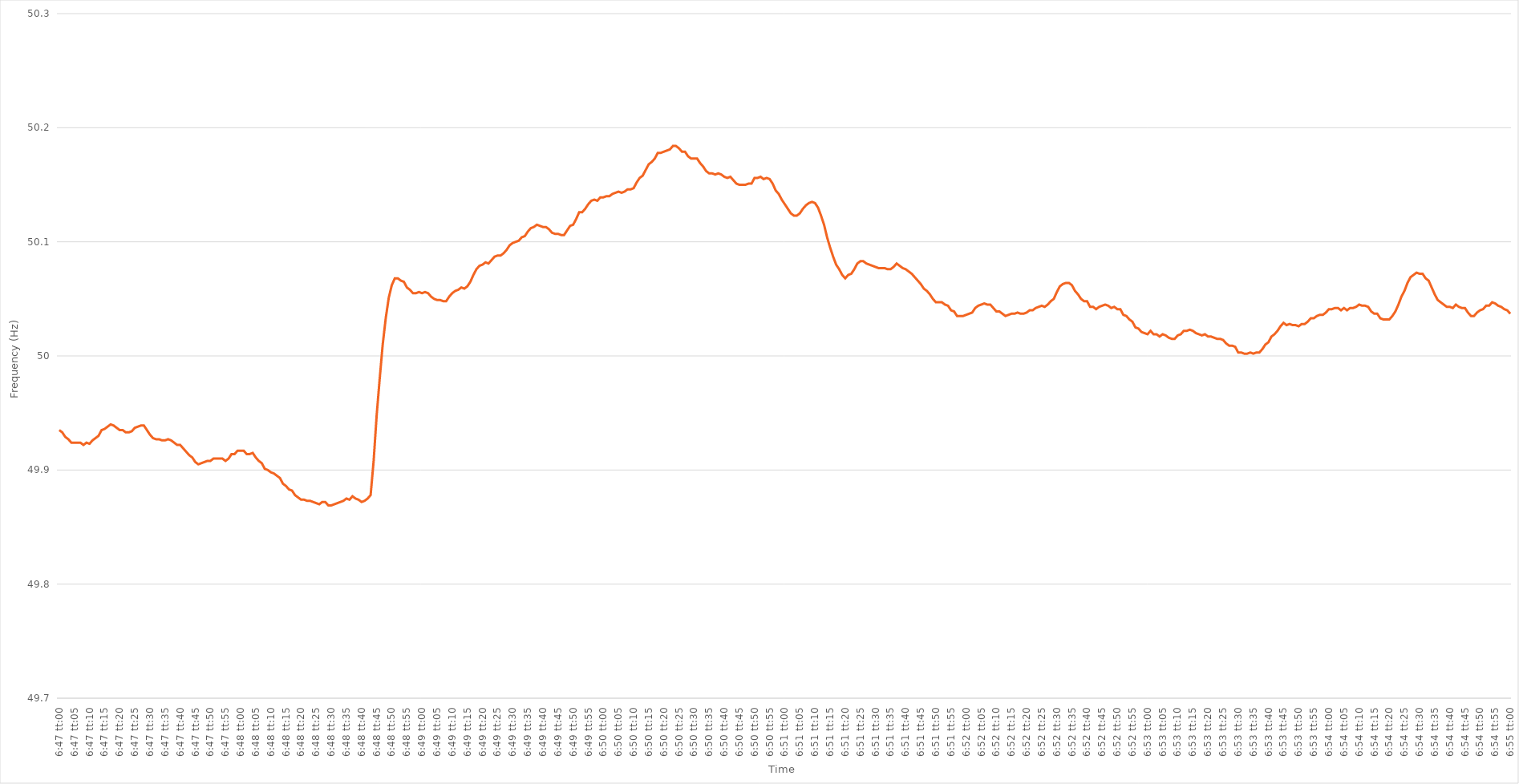
| Category | Series 0 |
|---|---|
| 0.2826388888888889 | 49.935 |
| 0.282650462962963 | 49.933 |
| 0.282662037037037 | 49.929 |
| 0.2826736111111111 | 49.927 |
| 0.2826851851851852 | 49.924 |
| 0.28269675925925924 | 49.924 |
| 0.28270833333333334 | 49.924 |
| 0.28271990740740743 | 49.924 |
| 0.2827314814814815 | 49.922 |
| 0.28274305555555557 | 49.924 |
| 0.28275462962962966 | 49.923 |
| 0.2827662037037037 | 49.926 |
| 0.2827777777777778 | 49.928 |
| 0.28278935185185183 | 49.93 |
| 0.28280092592592593 | 49.935 |
| 0.28281249999999997 | 49.936 |
| 0.28282407407407406 | 49.938 |
| 0.28283564814814816 | 49.94 |
| 0.2828472222222222 | 49.939 |
| 0.2828587962962963 | 49.937 |
| 0.2828703703703704 | 49.935 |
| 0.2828819444444444 | 49.935 |
| 0.2828935185185185 | 49.933 |
| 0.2829050925925926 | 49.933 |
| 0.28291666666666665 | 49.934 |
| 0.28292824074074074 | 49.937 |
| 0.28293981481481484 | 49.938 |
| 0.2829513888888889 | 49.939 |
| 0.28296296296296297 | 49.939 |
| 0.28297453703703707 | 49.935 |
| 0.2829861111111111 | 49.931 |
| 0.2829976851851852 | 49.928 |
| 0.28300925925925924 | 49.927 |
| 0.28302083333333333 | 49.927 |
| 0.28303240740740737 | 49.926 |
| 0.2830439814814815 | 49.926 |
| 0.28305555555555556 | 49.927 |
| 0.2830671296296296 | 49.926 |
| 0.2830787037037037 | 49.924 |
| 0.2830902777777778 | 49.922 |
| 0.2831018518518518 | 49.922 |
| 0.2831134259259259 | 49.919 |
| 0.283125 | 49.916 |
| 0.28313657407407405 | 49.913 |
| 0.28314814814814815 | 49.911 |
| 0.28315972222222224 | 49.907 |
| 0.2831712962962963 | 49.905 |
| 0.2831828703703704 | 49.906 |
| 0.28319444444444447 | 49.907 |
| 0.2832060185185185 | 49.908 |
| 0.2832175925925926 | 49.908 |
| 0.2832291666666667 | 49.91 |
| 0.28324074074074074 | 49.91 |
| 0.2832523148148148 | 49.91 |
| 0.2832638888888889 | 49.91 |
| 0.28327546296296297 | 49.908 |
| 0.283287037037037 | 49.91 |
| 0.2832986111111111 | 49.914 |
| 0.2833101851851852 | 49.914 |
| 0.28332175925925923 | 49.917 |
| 0.2833333333333333 | 49.917 |
| 0.2833449074074074 | 49.917 |
| 0.28335648148148146 | 49.914 |
| 0.28336805555555555 | 49.914 |
| 0.28337962962962965 | 49.915 |
| 0.2833912037037037 | 49.911 |
| 0.2834027777777778 | 49.908 |
| 0.2834143518518519 | 49.906 |
| 0.2834259259259259 | 49.901 |
| 0.2834375 | 49.9 |
| 0.2834490740740741 | 49.898 |
| 0.28346064814814814 | 49.897 |
| 0.28347222222222224 | 49.895 |
| 0.28348379629629633 | 49.893 |
| 0.28349537037037037 | 49.888 |
| 0.28350694444444446 | 49.886 |
| 0.2835185185185185 | 49.883 |
| 0.2835300925925926 | 49.882 |
| 0.28354166666666664 | 49.878 |
| 0.28355324074074073 | 49.876 |
| 0.2835648148148148 | 49.874 |
| 0.28357638888888886 | 49.874 |
| 0.28358796296296296 | 49.873 |
| 0.28359953703703705 | 49.873 |
| 0.2836111111111111 | 49.872 |
| 0.2836226851851852 | 49.871 |
| 0.2836342592592593 | 49.87 |
| 0.2836458333333333 | 49.872 |
| 0.2836574074074074 | 49.872 |
| 0.2836689814814815 | 49.869 |
| 0.28368055555555555 | 49.869 |
| 0.28369212962962964 | 49.87 |
| 0.28370370370370374 | 49.871 |
| 0.2837152777777778 | 49.872 |
| 0.28372685185185187 | 49.873 |
| 0.2837384259259259 | 49.875 |
| 0.28375 | 49.874 |
| 0.28376157407407404 | 49.877 |
| 0.28377314814814814 | 49.875 |
| 0.28378472222222223 | 49.874 |
| 0.28379629629629627 | 49.872 |
| 0.28380787037037036 | 49.873 |
| 0.28381944444444446 | 49.875 |
| 0.2838310185185185 | 49.878 |
| 0.2838425925925926 | 49.908 |
| 0.2838541666666667 | 49.948 |
| 0.2838657407407407 | 49.98 |
| 0.2838773148148148 | 50.01 |
| 0.2838888888888889 | 50.033 |
| 0.28390046296296295 | 50.051 |
| 0.28391203703703705 | 50.062 |
| 0.28392361111111114 | 50.068 |
| 0.2839351851851852 | 50.068 |
| 0.2839467592592593 | 50.066 |
| 0.2839583333333333 | 50.065 |
| 0.2839699074074074 | 50.06 |
| 0.28398148148148145 | 50.058 |
| 0.2839930555555556 | 50.055 |
| 0.28400462962962963 | 50.055 |
| 0.2840162037037037 | 50.056 |
| 0.28402777777777777 | 50.055 |
| 0.28403935185185186 | 50.056 |
| 0.2840509259259259 | 50.055 |
| 0.2840625 | 50.052 |
| 0.2840740740740741 | 50.05 |
| 0.28408564814814813 | 50.049 |
| 0.2840972222222222 | 50.049 |
| 0.2841087962962963 | 50.048 |
| 0.28412037037037036 | 50.048 |
| 0.28413194444444445 | 50.052 |
| 0.28414351851851855 | 50.055 |
| 0.2841550925925926 | 50.057 |
| 0.2841666666666667 | 50.058 |
| 0.2841782407407408 | 50.06 |
| 0.2841898148148148 | 50.059 |
| 0.28420138888888885 | 50.061 |
| 0.284212962962963 | 50.065 |
| 0.28422453703703704 | 50.071 |
| 0.2842361111111111 | 50.076 |
| 0.2842476851851852 | 50.079 |
| 0.28425925925925927 | 50.08 |
| 0.2842708333333333 | 50.082 |
| 0.2842824074074074 | 50.081 |
| 0.2842939814814815 | 50.084 |
| 0.28430555555555553 | 50.087 |
| 0.28431712962962963 | 50.088 |
| 0.2843287037037037 | 50.088 |
| 0.28434027777777776 | 50.09 |
| 0.28435185185185186 | 50.093 |
| 0.28436342592592595 | 50.097 |
| 0.284375 | 50.099 |
| 0.2843865740740741 | 50.1 |
| 0.2843981481481482 | 50.101 |
| 0.2844097222222222 | 50.104 |
| 0.2844212962962963 | 50.105 |
| 0.2844328703703704 | 50.109 |
| 0.28444444444444444 | 50.112 |
| 0.28445601851851854 | 50.113 |
| 0.2844675925925926 | 50.115 |
| 0.28447916666666667 | 50.114 |
| 0.2844907407407407 | 50.113 |
| 0.2845023148148148 | 50.113 |
| 0.2845138888888889 | 50.111 |
| 0.28452546296296294 | 50.108 |
| 0.28453703703703703 | 50.107 |
| 0.2845486111111111 | 50.107 |
| 0.28456018518518517 | 50.106 |
| 0.28457175925925926 | 50.106 |
| 0.28458333333333335 | 50.11 |
| 0.2845949074074074 | 50.114 |
| 0.2846064814814815 | 50.115 |
| 0.2846180555555556 | 50.12 |
| 0.2846296296296296 | 50.126 |
| 0.2846412037037037 | 50.126 |
| 0.2846527777777778 | 50.129 |
| 0.28466435185185185 | 50.133 |
| 0.28467592592592594 | 50.136 |
| 0.2846875 | 50.137 |
| 0.2846990740740741 | 50.136 |
| 0.2847106481481481 | 50.139 |
| 0.2847222222222222 | 50.139 |
| 0.2847337962962963 | 50.14 |
| 0.28474537037037034 | 50.14 |
| 0.28475694444444444 | 50.142 |
| 0.28476851851851853 | 50.143 |
| 0.28478009259259257 | 50.144 |
| 0.28479166666666667 | 50.143 |
| 0.28480324074074076 | 50.144 |
| 0.2848148148148148 | 50.146 |
| 0.2848263888888889 | 50.146 |
| 0.284837962962963 | 50.147 |
| 0.284849537037037 | 50.152 |
| 0.2848611111111111 | 50.156 |
| 0.2848726851851852 | 50.158 |
| 0.28488425925925925 | 50.163 |
| 0.28489583333333335 | 50.168 |
| 0.2849074074074074 | 50.17 |
| 0.2849189814814815 | 50.173 |
| 0.2849305555555555 | 50.178 |
| 0.28494212962962967 | 50.178 |
| 0.2849537037037037 | 50.179 |
| 0.28496527777777775 | 50.18 |
| 0.28497685185185184 | 50.181 |
| 0.28498842592592594 | 50.184 |
| 0.285 | 50.184 |
| 0.28501157407407407 | 50.182 |
| 0.28502314814814816 | 50.179 |
| 0.2850347222222222 | 50.179 |
| 0.2850462962962963 | 50.175 |
| 0.2850578703703704 | 50.173 |
| 0.28506944444444443 | 50.173 |
| 0.2850810185185185 | 50.173 |
| 0.2850925925925926 | 50.169 |
| 0.28510416666666666 | 50.166 |
| 0.28511574074074075 | 50.162 |
| 0.28512731481481485 | 50.16 |
| 0.2851388888888889 | 50.16 |
| 0.2851504629629629 | 50.159 |
| 0.2851620370370371 | 50.16 |
| 0.2851736111111111 | 50.159 |
| 0.28518518518518515 | 50.157 |
| 0.28519675925925925 | 50.156 |
| 0.28520833333333334 | 50.157 |
| 0.2852199074074074 | 50.154 |
| 0.2852314814814815 | 50.151 |
| 0.28524305555555557 | 50.15 |
| 0.2852546296296296 | 50.15 |
| 0.2852662037037037 | 50.15 |
| 0.2852777777777778 | 50.151 |
| 0.28528935185185184 | 50.151 |
| 0.28530092592592593 | 50.156 |
| 0.2853125 | 50.156 |
| 0.28532407407407406 | 50.157 |
| 0.28533564814814816 | 50.155 |
| 0.28534722222222225 | 50.156 |
| 0.2853587962962963 | 50.155 |
| 0.28537037037037033 | 50.151 |
| 0.2853819444444445 | 50.145 |
| 0.2853935185185185 | 50.142 |
| 0.2854050925925926 | 50.137 |
| 0.28541666666666665 | 50.133 |
| 0.28542824074074075 | 50.129 |
| 0.2854398148148148 | 50.125 |
| 0.2854513888888889 | 50.123 |
| 0.285462962962963 | 50.123 |
| 0.285474537037037 | 50.125 |
| 0.2854861111111111 | 50.129 |
| 0.2854976851851852 | 50.132 |
| 0.28550925925925924 | 50.134 |
| 0.28552083333333333 | 50.135 |
| 0.28553240740740743 | 50.134 |
| 0.28554398148148147 | 50.13 |
| 0.28555555555555556 | 50.123 |
| 0.28556712962962966 | 50.115 |
| 0.2855787037037037 | 50.104 |
| 0.2855902777777778 | 50.095 |
| 0.2856018518518519 | 50.087 |
| 0.2856134259259259 | 50.08 |
| 0.285625 | 50.076 |
| 0.28563657407407406 | 50.071 |
| 0.28564814814814815 | 50.068 |
| 0.2856597222222222 | 50.071 |
| 0.2856712962962963 | 50.072 |
| 0.2856828703703704 | 50.076 |
| 0.2856944444444444 | 50.081 |
| 0.2857060185185185 | 50.083 |
| 0.2857175925925926 | 50.083 |
| 0.28572916666666665 | 50.081 |
| 0.28574074074074074 | 50.08 |
| 0.28575231481481483 | 50.079 |
| 0.2857638888888889 | 50.078 |
| 0.28577546296296297 | 50.077 |
| 0.28578703703703706 | 50.077 |
| 0.2857986111111111 | 50.077 |
| 0.2858101851851852 | 50.076 |
| 0.2858217592592593 | 50.076 |
| 0.28583333333333333 | 50.078 |
| 0.2858449074074074 | 50.081 |
| 0.28585648148148146 | 50.079 |
| 0.28586805555555556 | 50.077 |
| 0.2858796296296296 | 50.076 |
| 0.2858912037037037 | 50.074 |
| 0.2859027777777778 | 50.072 |
| 0.2859143518518518 | 50.069 |
| 0.2859259259259259 | 50.066 |
| 0.2859375 | 50.063 |
| 0.28594907407407405 | 50.059 |
| 0.28596064814814814 | 50.057 |
| 0.28597222222222224 | 50.054 |
| 0.2859837962962963 | 50.05 |
| 0.28599537037037037 | 50.047 |
| 0.28600694444444447 | 50.047 |
| 0.2860185185185185 | 50.047 |
| 0.2860300925925926 | 50.045 |
| 0.2860416666666667 | 50.044 |
| 0.28605324074074073 | 50.04 |
| 0.2860648148148148 | 50.039 |
| 0.2860763888888889 | 50.035 |
| 0.28608796296296296 | 50.035 |
| 0.286099537037037 | 50.035 |
| 0.28611111111111115 | 50.036 |
| 0.2861226851851852 | 50.037 |
| 0.2861342592592592 | 50.038 |
| 0.2861458333333333 | 50.042 |
| 0.2861574074074074 | 50.044 |
| 0.28616898148148145 | 50.045 |
| 0.28618055555555555 | 50.046 |
| 0.28619212962962964 | 50.045 |
| 0.2862037037037037 | 50.045 |
| 0.2862152777777778 | 50.042 |
| 0.28622685185185187 | 50.039 |
| 0.2862384259259259 | 50.039 |
| 0.28625 | 50.037 |
| 0.2862615740740741 | 50.035 |
| 0.28627314814814814 | 50.036 |
| 0.28628472222222223 | 50.037 |
| 0.2862962962962963 | 50.037 |
| 0.28630787037037037 | 50.038 |
| 0.2863194444444444 | 50.037 |
| 0.28633101851851855 | 50.037 |
| 0.2863425925925926 | 50.038 |
| 0.2863541666666667 | 50.04 |
| 0.2863657407407407 | 50.04 |
| 0.2863773148148148 | 50.042 |
| 0.28638888888888886 | 50.043 |
| 0.28640046296296295 | 50.044 |
| 0.28641203703703705 | 50.043 |
| 0.2864236111111111 | 50.045 |
| 0.2864351851851852 | 50.048 |
| 0.2864467592592593 | 50.05 |
| 0.2864583333333333 | 50.056 |
| 0.2864699074074074 | 50.061 |
| 0.2864814814814815 | 50.063 |
| 0.28649305555555554 | 50.064 |
| 0.28650462962962964 | 50.064 |
| 0.28651620370370373 | 50.062 |
| 0.28652777777777777 | 50.057 |
| 0.28653935185185186 | 50.054 |
| 0.28655092592592596 | 50.05 |
| 0.2865625 | 50.048 |
| 0.2865740740740741 | 50.048 |
| 0.28658564814814813 | 50.043 |
| 0.2865972222222222 | 50.043 |
| 0.28660879629629626 | 50.041 |
| 0.28662037037037036 | 50.043 |
| 0.28663194444444445 | 50.044 |
| 0.2866435185185185 | 50.045 |
| 0.2866550925925926 | 50.044 |
| 0.2866666666666667 | 50.042 |
| 0.2866782407407407 | 50.043 |
| 0.2866898148148148 | 50.041 |
| 0.2867013888888889 | 50.041 |
| 0.28671296296296295 | 50.036 |
| 0.28672453703703704 | 50.035 |
| 0.28673611111111114 | 50.032 |
| 0.2867476851851852 | 50.03 |
| 0.28675925925925927 | 50.025 |
| 0.28677083333333336 | 50.024 |
| 0.2867824074074074 | 50.021 |
| 0.2867939814814815 | 50.02 |
| 0.28680555555555554 | 50.019 |
| 0.28681712962962963 | 50.022 |
| 0.28682870370370367 | 50.019 |
| 0.28684027777777776 | 50.019 |
| 0.28685185185185186 | 50.017 |
| 0.2868634259259259 | 50.019 |
| 0.286875 | 50.018 |
| 0.2868865740740741 | 50.016 |
| 0.2868981481481481 | 50.015 |
| 0.2869097222222222 | 50.015 |
| 0.2869212962962963 | 50.018 |
| 0.28693287037037035 | 50.019 |
| 0.28694444444444445 | 50.022 |
| 0.28695601851851854 | 50.022 |
| 0.2869675925925926 | 50.023 |
| 0.2869791666666667 | 50.022 |
| 0.28699074074074077 | 50.02 |
| 0.2870023148148148 | 50.019 |
| 0.2870138888888889 | 50.018 |
| 0.287025462962963 | 50.019 |
| 0.28703703703703703 | 50.017 |
| 0.2870486111111111 | 50.017 |
| 0.2870601851851852 | 50.016 |
| 0.28707175925925926 | 50.015 |
| 0.2870833333333333 | 50.015 |
| 0.2870949074074074 | 50.014 |
| 0.2871064814814815 | 50.011 |
| 0.28711805555555553 | 50.009 |
| 0.2871296296296296 | 50.009 |
| 0.2871412037037037 | 50.008 |
| 0.28715277777777776 | 50.003 |
| 0.28716435185185185 | 50.003 |
| 0.28717592592592595 | 50.002 |
| 0.2871875 | 50.002 |
| 0.2871990740740741 | 50.003 |
| 0.2872106481481482 | 50.002 |
| 0.2872222222222222 | 50.003 |
| 0.2872337962962963 | 50.003 |
| 0.2872453703703704 | 50.006 |
| 0.28725694444444444 | 50.01 |
| 0.2872685185185185 | 50.012 |
| 0.28728009259259263 | 50.017 |
| 0.28729166666666667 | 50.019 |
| 0.28730324074074076 | 50.022 |
| 0.2873148148148148 | 50.026 |
| 0.2873263888888889 | 50.029 |
| 0.28733796296296293 | 50.027 |
| 0.28734953703703703 | 50.028 |
| 0.2873611111111111 | 50.027 |
| 0.28737268518518516 | 50.027 |
| 0.28738425925925926 | 50.026 |
| 0.28739583333333335 | 50.028 |
| 0.2874074074074074 | 50.028 |
| 0.2874189814814815 | 50.03 |
| 0.2874305555555556 | 50.033 |
| 0.2874421296296296 | 50.033 |
| 0.2874537037037037 | 50.035 |
| 0.2874652777777778 | 50.036 |
| 0.28747685185185184 | 50.036 |
| 0.28748842592592594 | 50.038 |
| 0.28750000000000003 | 50.041 |
| 0.28751157407407407 | 50.041 |
| 0.28752314814814817 | 50.042 |
| 0.2875347222222222 | 50.042 |
| 0.2875462962962963 | 50.04 |
| 0.28755787037037034 | 50.042 |
| 0.28756944444444443 | 50.04 |
| 0.2875810185185185 | 50.042 |
| 0.28759259259259257 | 50.042 |
| 0.28760416666666666 | 50.043 |
| 0.28761574074074076 | 50.045 |
| 0.2876273148148148 | 50.044 |
| 0.2876388888888889 | 50.044 |
| 0.287650462962963 | 50.043 |
| 0.287662037037037 | 50.039 |
| 0.2876736111111111 | 50.037 |
| 0.2876851851851852 | 50.037 |
| 0.28769675925925925 | 50.033 |
| 0.28770833333333334 | 50.032 |
| 0.28771990740740744 | 50.032 |
| 0.2877314814814815 | 50.032 |
| 0.28774305555555557 | 50.035 |
| 0.2877546296296296 | 50.039 |
| 0.2877662037037037 | 50.045 |
| 0.28777777777777774 | 50.052 |
| 0.28778935185185184 | 50.057 |
| 0.28780092592592593 | 50.064 |
| 0.28781249999999997 | 50.069 |
| 0.28782407407407407 | 50.071 |
| 0.28783564814814816 | 50.073 |
| 0.2878472222222222 | 50.072 |
| 0.2878587962962963 | 50.072 |
| 0.2878703703703704 | 50.068 |
| 0.2878819444444444 | 50.066 |
| 0.2878935185185185 | 50.06 |
| 0.2879050925925926 | 50.054 |
| 0.28791666666666665 | 50.049 |
| 0.28792824074074075 | 50.047 |
| 0.28793981481481484 | 50.045 |
| 0.2879513888888889 | 50.043 |
| 0.287962962962963 | 50.043 |
| 0.287974537037037 | 50.042 |
| 0.2879861111111111 | 50.045 |
| 0.28799768518518515 | 50.043 |
| 0.2880092592592593 | 50.042 |
| 0.28802083333333334 | 50.042 |
| 0.2880324074074074 | 50.038 |
| 0.28804398148148147 | 50.035 |
| 0.28805555555555556 | 50.035 |
| 0.2880671296296296 | 50.038 |
| 0.2880787037037037 | 50.04 |
| 0.2880902777777778 | 50.041 |
| 0.28810185185185183 | 50.044 |
| 0.2881134259259259 | 50.044 |
| 0.288125 | 50.047 |
| 0.28813657407407406 | 50.046 |
| 0.28814814814814815 | 50.044 |
| 0.28815972222222225 | 50.043 |
| 0.2881712962962963 | 50.041 |
| 0.2881828703703704 | 50.04 |
| 0.2881944444444445 | 50.037 |